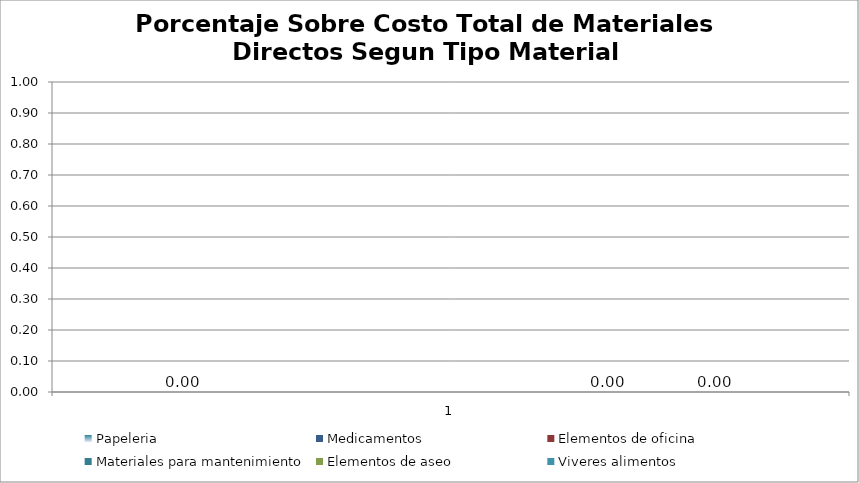
| Category | Papeleria | Medicamentos | Elementos de oficina | Materiales para mantenimiento | Elementos de aseo | Viveres alimentos |
|---|---|---|---|---|---|---|
| 0 | 0 | 0 | 0 | 0 | 0 | 0 |